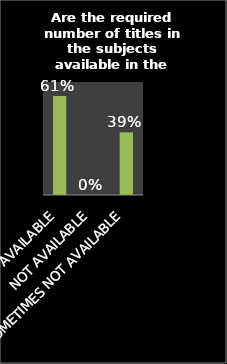
| Category | Series 0 |
|---|---|
| AVAILABLE | 0.613 |
| NOT AVAILABLE | 0 |
| SOMETIMES NOT AVAILABLE | 0.388 |